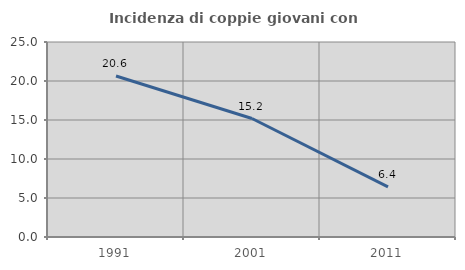
| Category | Incidenza di coppie giovani con figli |
|---|---|
| 1991.0 | 20.641 |
| 2001.0 | 15.19 |
| 2011.0 | 6.433 |